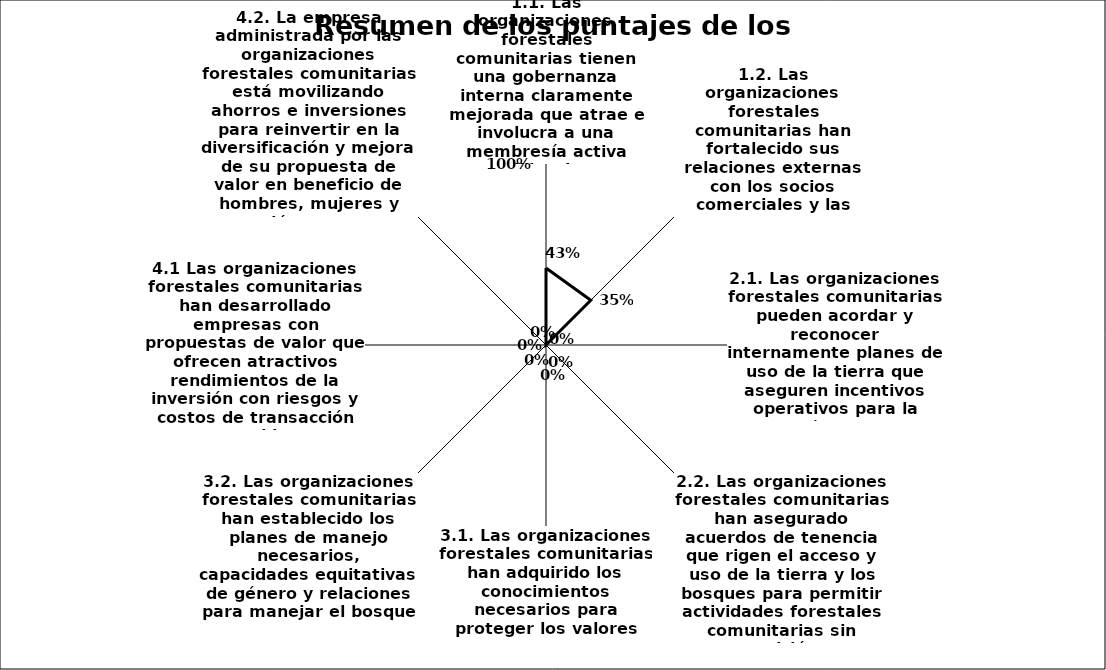
| Category | Series 0 |
|---|---|
| 1.1. Las organizaciones forestales comunitarias tienen una gobernanza interna claramente mejorada que atrae e involucra a una membresía activa equilibrada en términos de género. | 0.425 |
| 1.2. Las organizaciones forestales comunitarias han fortalecido sus relaciones externas con los socios comerciales y las redes de apoyo que conducen al logro de su visión y objetivo. | 0.35 |
| 2.1. Las organizaciones forestales comunitarias pueden acordar y reconocer internamente planes de uso de la tierra que aseguren incentivos operativos para la gestión forestal sostenible. | 0 |
| 2.2. Las organizaciones forestales comunitarias han asegurado acuerdos de tenencia que rigen el acceso y uso de la tierra y los bosques para permitir actividades forestales comunitarias sin oposición.  | 0 |
| 3.1. Las organizaciones forestales comunitarias han adquirido los conocimientos necesarios para proteger los valores ambientales  | 0 |
| 3.2. Las organizaciones forestales comunitarias han establecido los planes de manejo necesarios, capacidades equitativas de género y relaciones para manejar el bosque de manera sostenible.  | 0 |
| 4.1 Las organizaciones forestales comunitarias han desarrollado empresas con propuestas de valor que ofrecen atractivos rendimientos de la inversión con riesgos y costos de transacción aceptables.  | 0 |
| 4.2. La empresa administrada por las organizaciones forestales comunitarias está movilizando ahorros e inversiones para reinvertir en la diversificación y mejora de su propuesta de valor en beneficio de hombres, mujeres y jóvenes. | 0 |